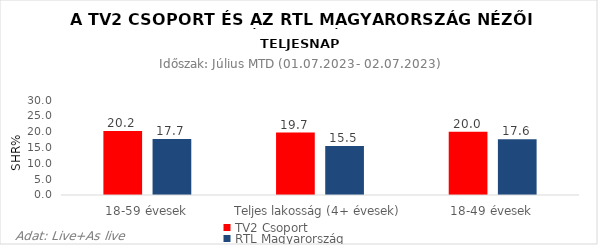
| Category | TV2 Csoport | RTL Magyarország |
|---|---|---|
| 18-59 évesek | 20.2 | 17.7 |
| Teljes lakosság (4+ évesek) | 19.7 | 15.5 |
| 18-49 évesek | 20 | 17.6 |